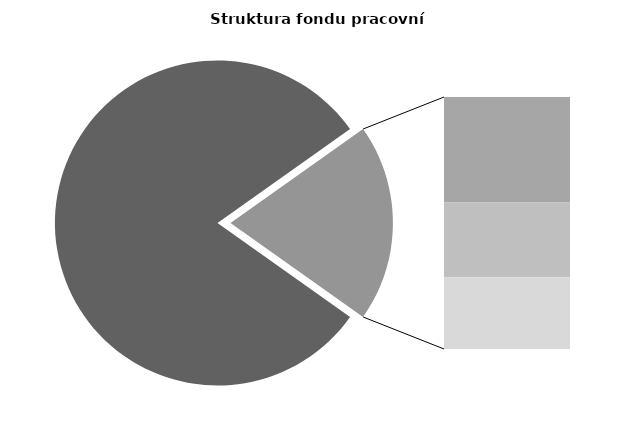
| Category | Series 0 |
|---|---|
| Průměrná měsíční odpracovaná doba bez přesčasu | 137.104 |
| Dovolená | 14.018 |
| Nemoc | 9.932 |
| Jiné | 9.532 |